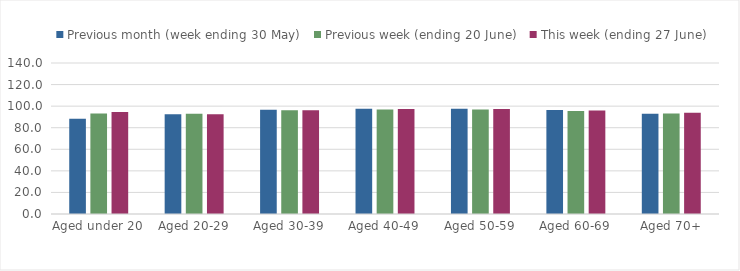
| Category | Previous month (week ending 30 May) | Previous week (ending 20 June) | This week (ending 27 June) |
|---|---|---|---|
| Aged under 20 | 88.235 | 93.225 | 94.486 |
| Aged 20-29 | 92.455 | 92.909 | 92.438 |
| Aged 30-39 | 96.609 | 96.131 | 96.219 |
| Aged 40-49 | 97.513 | 96.967 | 97.386 |
| Aged 50-59 | 97.63 | 96.812 | 97.292 |
| Aged 60-69 | 96.45 | 95.392 | 95.883 |
| Aged 70+ | 92.909 | 93.234 | 93.792 |